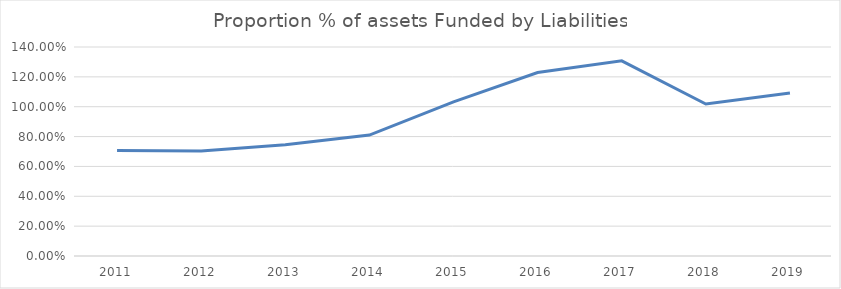
| Category | Series 0 |
|---|---|
| 2011.0 | 0.706 |
| 2012.0 | 0.703 |
| 2013.0 | 0.746 |
| 2014.0 | 0.81 |
| 2015.0 | 1.033 |
| 2016.0 | 1.229 |
| 2017.0 | 1.307 |
| 2018.0 | 1.018 |
| 2019.0 | 1.091 |